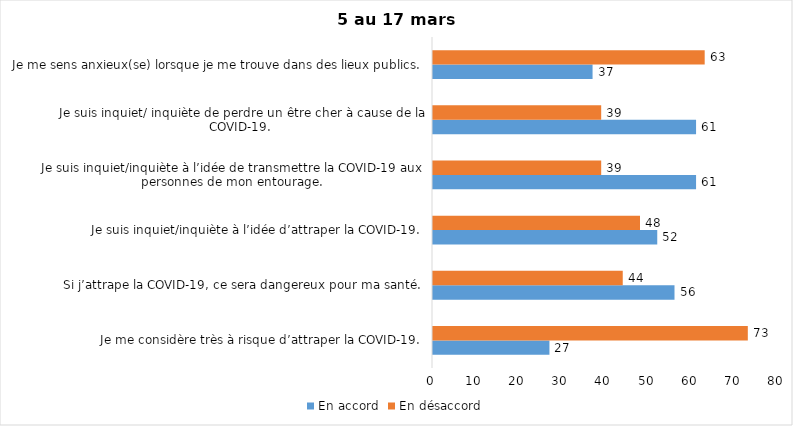
| Category | En accord | En désaccord |
|---|---|---|
| Je me considère très à risque d’attraper la COVID-19. | 27 | 73 |
| Si j’attrape la COVID-19, ce sera dangereux pour ma santé. | 56 | 44 |
| Je suis inquiet/inquiète à l’idée d’attraper la COVID-19. | 52 | 48 |
| Je suis inquiet/inquiète à l’idée de transmettre la COVID-19 aux personnes de mon entourage. | 61 | 39 |
| Je suis inquiet/ inquiète de perdre un être cher à cause de la COVID-19. | 61 | 39 |
| Je me sens anxieux(se) lorsque je me trouve dans des lieux publics. | 37 | 63 |